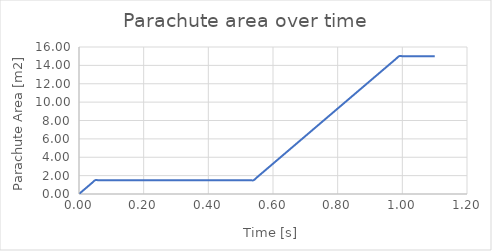
| Category | Series 0 |
|---|---|
| 0.0 | 0 |
| 0.01 | 0.3 |
| 0.02 | 0.6 |
| 0.03 | 0.9 |
| 0.04 | 1.2 |
| 0.05 | 1.5 |
| 0.060000000000000005 | 1.5 |
| 0.07 | 1.5 |
| 0.08 | 1.5 |
| 0.09 | 1.5 |
| 0.09999999999999999 | 1.5 |
| 0.10999999999999999 | 1.5 |
| 0.11999999999999998 | 1.5 |
| 0.12999999999999998 | 1.5 |
| 0.13999999999999999 | 1.5 |
| 0.15 | 1.5 |
| 0.16 | 1.5 |
| 0.17 | 1.5 |
| 0.18000000000000002 | 1.5 |
| 0.19000000000000003 | 1.5 |
| 0.20000000000000004 | 1.5 |
| 0.21000000000000005 | 1.5 |
| 0.22000000000000006 | 1.5 |
| 0.23000000000000007 | 1.5 |
| 0.24000000000000007 | 1.5 |
| 0.25000000000000006 | 1.5 |
| 0.26000000000000006 | 1.5 |
| 0.2700000000000001 | 1.5 |
| 0.2800000000000001 | 1.5 |
| 0.2900000000000001 | 1.5 |
| 0.3000000000000001 | 1.5 |
| 0.3100000000000001 | 1.5 |
| 0.3200000000000001 | 1.5 |
| 0.3300000000000001 | 1.5 |
| 0.34000000000000014 | 1.5 |
| 0.35000000000000014 | 1.5 |
| 0.36000000000000015 | 1.5 |
| 0.37000000000000016 | 1.5 |
| 0.38000000000000017 | 1.5 |
| 0.3900000000000002 | 1.5 |
| 0.4000000000000002 | 1.5 |
| 0.4100000000000002 | 1.5 |
| 0.4200000000000002 | 1.5 |
| 0.4300000000000002 | 1.5 |
| 0.4400000000000002 | 1.5 |
| 0.45000000000000023 | 1.5 |
| 0.46000000000000024 | 1.5 |
| 0.47000000000000025 | 1.5 |
| 0.48000000000000026 | 1.5 |
| 0.49000000000000027 | 1.5 |
| 0.5000000000000002 | 1.5 |
| 0.5100000000000002 | 1.5 |
| 0.5200000000000002 | 1.5 |
| 0.5300000000000002 | 1.5 |
| 0.5400000000000003 | 1.5 |
| 0.5500000000000003 | 1.8 |
| 0.5600000000000003 | 2.1 |
| 0.5700000000000003 | 2.4 |
| 0.5800000000000003 | 2.7 |
| 0.5900000000000003 | 3 |
| 0.6000000000000003 | 3.3 |
| 0.6100000000000003 | 3.6 |
| 0.6200000000000003 | 3.9 |
| 0.6300000000000003 | 4.2 |
| 0.6400000000000003 | 4.5 |
| 0.6500000000000004 | 4.8 |
| 0.6600000000000004 | 5.1 |
| 0.6700000000000004 | 5.4 |
| 0.6800000000000004 | 5.7 |
| 0.6900000000000004 | 6 |
| 0.7000000000000004 | 6.3 |
| 0.7100000000000004 | 6.6 |
| 0.7200000000000004 | 6.9 |
| 0.7300000000000004 | 7.2 |
| 0.7400000000000004 | 7.5 |
| 0.7500000000000004 | 7.8 |
| 0.7600000000000005 | 8.1 |
| 0.7700000000000005 | 8.4 |
| 0.7800000000000005 | 8.7 |
| 0.7900000000000005 | 9 |
| 0.8000000000000005 | 9.3 |
| 0.8100000000000005 | 9.6 |
| 0.8200000000000005 | 9.9 |
| 0.8300000000000005 | 10.2 |
| 0.8400000000000005 | 10.5 |
| 0.8500000000000005 | 10.8 |
| 0.8600000000000005 | 11.1 |
| 0.8700000000000006 | 11.4 |
| 0.8800000000000006 | 11.7 |
| 0.8900000000000006 | 12 |
| 0.9000000000000006 | 12.3 |
| 0.9100000000000006 | 12.6 |
| 0.9200000000000006 | 12.9 |
| 0.9300000000000006 | 13.2 |
| 0.9400000000000006 | 13.5 |
| 0.9500000000000006 | 13.8 |
| 0.9600000000000006 | 14.1 |
| 0.9700000000000006 | 14.4 |
| 0.9800000000000006 | 14.7 |
| 0.9900000000000007 | 15 |
| 1.0000000000000007 | 15 |
| 1.0100000000000007 | 15 |
| 1.0200000000000007 | 15 |
| 1.0300000000000007 | 15 |
| 1.0400000000000007 | 15 |
| 1.0500000000000007 | 15 |
| 1.0600000000000007 | 15 |
| 1.0700000000000007 | 15 |
| 1.0800000000000007 | 15 |
| 1.0900000000000007 | 15 |
| 1.1000000000000008 | 15 |